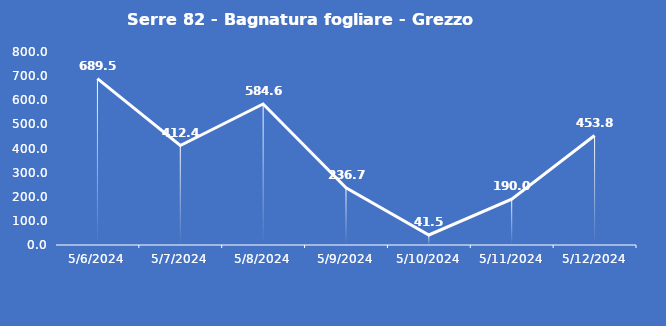
| Category | Serre 82 - Bagnatura fogliare - Grezzo (min) |
|---|---|
| 5/6/24 | 689.5 |
| 5/7/24 | 412.4 |
| 5/8/24 | 584.6 |
| 5/9/24 | 236.7 |
| 5/10/24 | 41.5 |
| 5/11/24 | 190 |
| 5/12/24 | 453.8 |